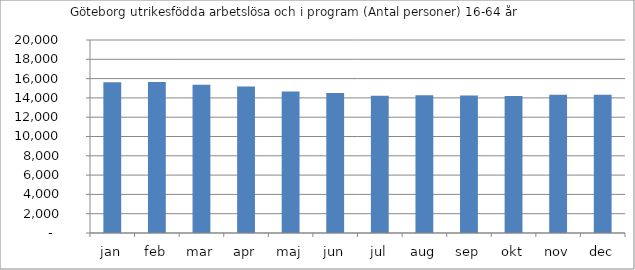
| Category | Göteborg |
|---|---|
| jan | 15620 |
| feb | 15635 |
| mar | 15372 |
| apr | 15183 |
| maj | 14662 |
| jun | 14517 |
| jul | 14220 |
| aug | 14277 |
| sep | 14246 |
| okt | 14205 |
| nov | 14328 |
| dec | 14324 |